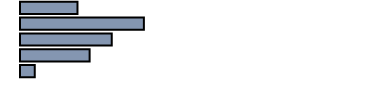
| Category | Series 0 |
|---|---|
| 0 | 16.1 |
| 1 | 34.7 |
| 2 | 25.7 |
| 3 | 19.5 |
| 4 | 4.1 |